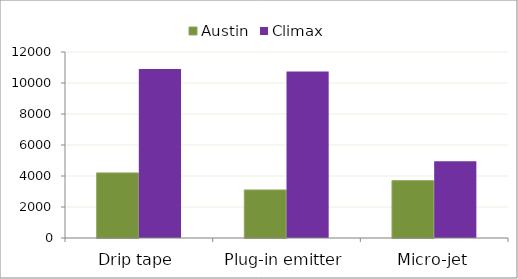
| Category | Austin | Climax |
|---|---|---|
| Drip tape | 4200 | 10900 |
| Plug-in emitter | 3100 | 10750 |
| Micro-jet | 3700 | 4950 |